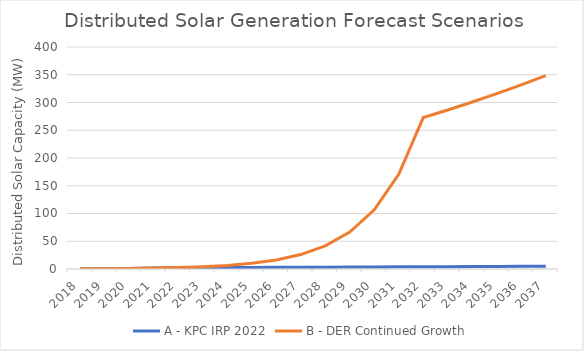
| Category | A - KPC IRP 2022 |  B - DER Continued Growth   |
|---|---|---|
| 2018.0 | 0.275 | 0.275 |
| 2019.0 | 0.297 | 0.297 |
| 2020.0 | 0.988 | 0.988 |
| 2021.0 | 1.761 | 1.761 |
| 2022.0 | 2.482 | 2.482 |
| 2023.0 | 2.606 | 3.971 |
| 2024.0 | 2.736 | 6.354 |
| 2025.0 | 2.873 | 10.166 |
| 2026.0 | 3.017 | 16.266 |
| 2027.0 | 3.168 | 26.026 |
| 2028.0 | 3.326 | 41.641 |
| 2029.0 | 3.492 | 66.626 |
| 2030.0 | 3.667 | 106.601 |
| 2031.0 | 3.85 | 170.562 |
| 2032.0 | 4.043 | 272.899 |
| 2033.0 | 4.245 | 286.544 |
| 2034.0 | 4.457 | 300.871 |
| 2035.0 | 4.68 | 315.914 |
| 2036.0 | 4.914 | 331.71 |
| 2037.0 | 5.16 | 348.296 |